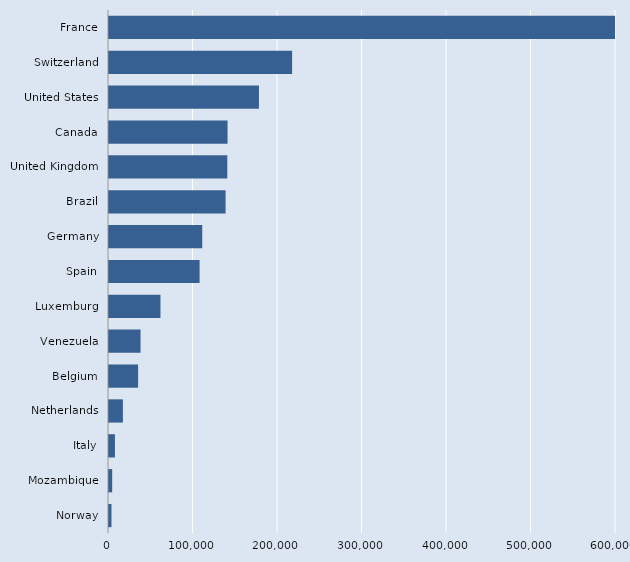
| Category | Series 0 |
|---|---|
| Norway | 2925 |
| Mozambique | 3767 |
| Italy | 7023 |
| Netherlands | 16456 |
| Belgium | 34455 |
| Venezuela | 37326 |
| Luxemburg | 60897 |
| Spain | 107226 |
| Germany | 110384 |
| Brazil | 137973 |
| United Kingdom | 140000 |
| Canada | 140310 |
| United States | 177431 |
| Switzerland | 216714 |
| France | 606897 |